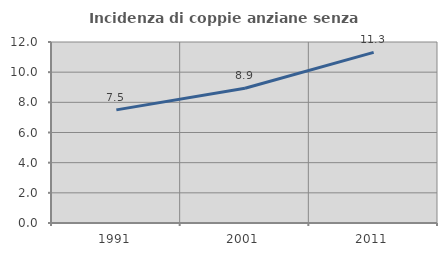
| Category | Incidenza di coppie anziane senza figli  |
|---|---|
| 1991.0 | 7.5 |
| 2001.0 | 8.934 |
| 2011.0 | 11.315 |